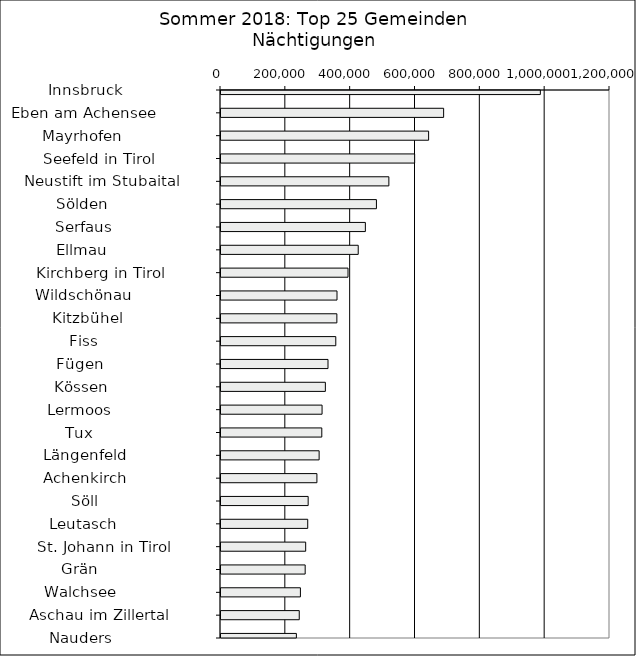
| Category | Series 0 |
|---|---|
|   Innsbruck                  | 985134 |
|   Eben am Achensee           | 686793 |
|   Mayrhofen                  | 640481 |
|   Seefeld in Tirol           | 597394 |
|   Neustift im Stubaital      | 517842 |
|   Sölden                     | 479459 |
|   Serfaus                    | 445351 |
|   Ellmau                     | 423338 |
|   Kirchberg in Tirol         | 391856 |
|   Wildschönau                | 357851 |
|   Kitzbühel                  | 357437 |
|   Fiss                       | 354115 |
|   Fügen                      | 330113 |
|   Kössen                     | 321974 |
|   Lermoos                    | 311777 |
|   Tux                        | 310947 |
|   Längenfeld                 | 302741 |
|   Achenkirch                 | 295900 |
|   Söll                       | 268865 |
|   Leutasch                   | 267520 |
|   St. Johann in Tirol        | 261234 |
|   Grän                       | 259664 |
|   Walchsee                   | 244980 |
|   Aschau im Zillertal        | 241425 |
|   Nauders                    | 232538 |